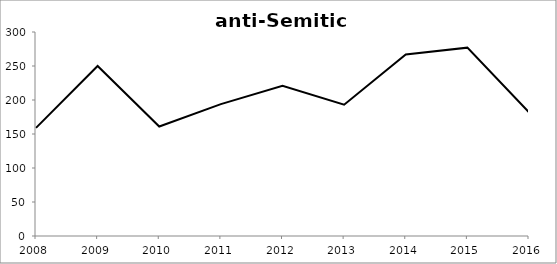
| Category | Series 1 |
|---|---|
| 2008.0 | 159 |
| 2009.0 | 250 |
| 2010.0 | 161 |
| 2011.0 | 194 |
| 2012.0 | 221 |
| 2013.0 | 193 |
| 2014.0 | 267 |
| 2015.0 | 277 |
| 2016.0 | 182 |